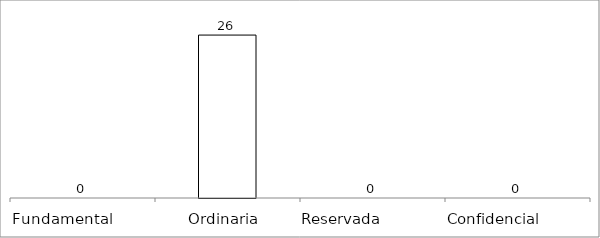
| Category | Series 0 |
|---|---|
| Fundamental         | 0 |
| Ordinaria  | 26 |
| Reservada               | 0 |
| Confidencial             | 0 |